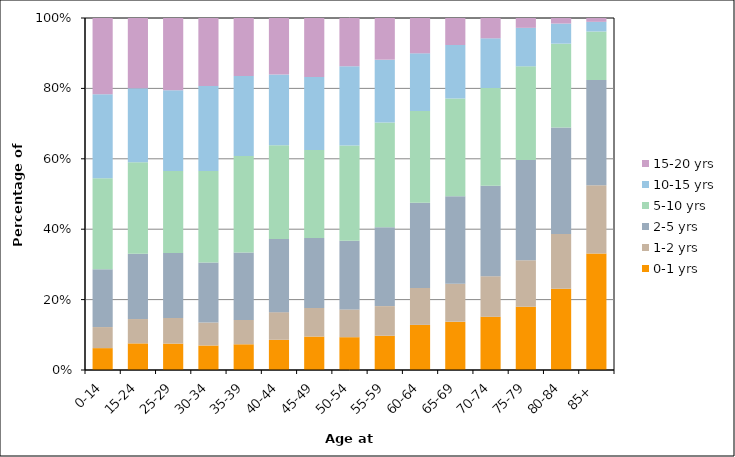
| Category | 0-1 yrs | 1-2 yrs | 2-5 yrs | 5-10 yrs | 10-15 yrs | 15-20 yrs |
|---|---|---|---|---|---|---|
| 0-14 | 1357 | 1306 | 3585 | 5644 | 5214 | 4726 |
| 15-24 | 2022 | 1848 | 4967 | 6947 | 5609 | 5338 |
| 25-29 | 2287 | 2218 | 5623 | 7105 | 6994 | 6252 |
| 30-34 | 3120 | 2930 | 7631 | 11674 | 10828 | 8646 |
| 35-39 | 4715 | 4466 | 12352 | 17680 | 14691 | 10608 |
| 40-44 | 7906 | 7221 | 19116 | 24566 | 18462 | 14800 |
| 45-49 | 12027 | 10294 | 25108 | 31668 | 26284 | 21185 |
| 50-54 | 16158 | 13683 | 33795 | 46942 | 38991 | 23744 |
| 55-59 | 20556 | 17805 | 47401 | 62819 | 37726 | 25025 |
| 60-64 | 32515 | 26697 | 61435 | 66170 | 41514 | 25483 |
| 65-69 | 34278 | 26941 | 62084 | 69287 | 38020 | 19152 |
| 70-74 | 32549 | 24837 | 55364 | 59849 | 30392 | 12439 |
| 75-79 | 29064 | 21434 | 46109 | 43051 | 17688 | 4526 |
| 80-84 | 20952 | 14096 | 27391 | 21595 | 5181 | 1433 |
| 85+ | 16090 | 9410 | 14534 | 6704 | 1332 | 530 |